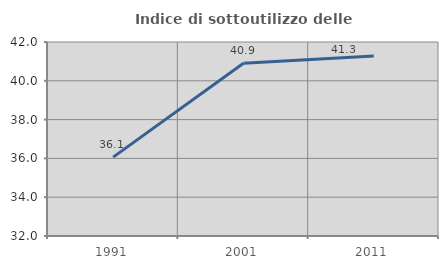
| Category | Indice di sottoutilizzo delle abitazioni  |
|---|---|
| 1991.0 | 36.065 |
| 2001.0 | 40.905 |
| 2011.0 | 41.274 |